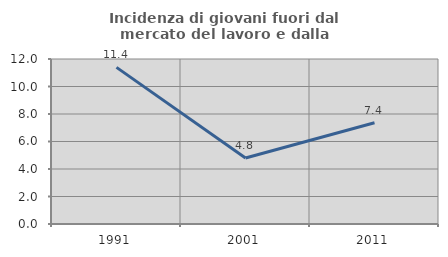
| Category | Incidenza di giovani fuori dal mercato del lavoro e dalla formazione  |
|---|---|
| 1991.0 | 11.392 |
| 2001.0 | 4.8 |
| 2011.0 | 7.368 |